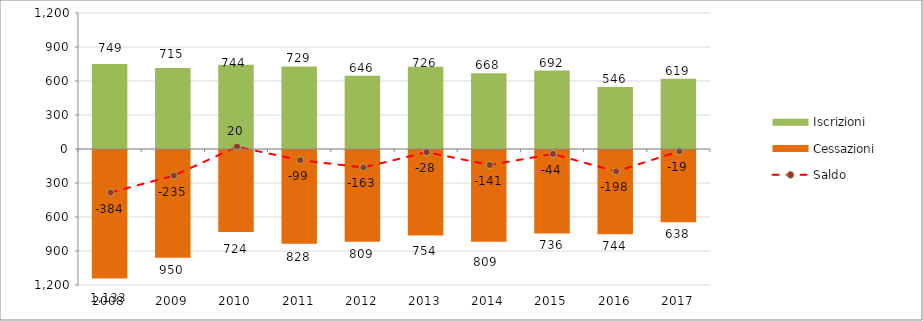
| Category | Iscrizioni | Cessazioni |
|---|---|---|
| 2008.0 | 749 | -1133 |
| 2009.0 | 715 | -950 |
| 2010.0 | 744 | -724 |
| 2011.0 | 729 | -828 |
| 2012.0 | 646 | -809 |
| 2013.0 | 726 | -754 |
| 2014.0 | 668 | -809 |
| 2015.0 | 692 | -736 |
| 2016.0 | 546 | -744 |
| 2017.0 | 619 | -638 |